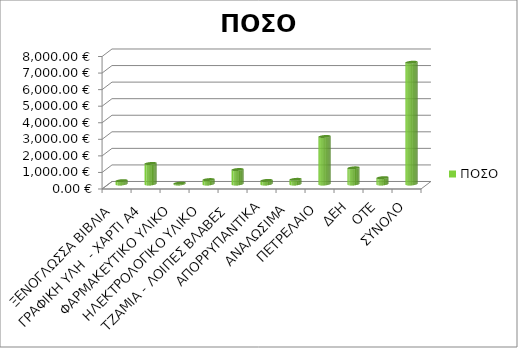
| Category | ΠΟΣΟ |
|---|---|
| ΞΕΝΟΓΛΩΣΣΑ ΒΙΒΛΙΑ | 201.1 |
| ΓΡΑΦΙΚΗ ΥΛΗ  - ΧΑΡΤΙ Α4 | 1240 |
| ΦΑΡΜΑΚΕΥΤΙΚΟ ΥΛΙΚΟ | 48.45 |
| ΗΛΕΚΤΡΟΛΟΓΙΚΟ ΥΛΙΚΟ | 265.8 |
| ΤΖΑΜΙΑ - ΛΟΙΠΕΣ ΒΛΑΒΕΣ | 873.5 |
| ΑΠΟΡΡΥΠΑΝΤΙΚΑ | 215.3 |
| ΑΝΑΛΩΣΙΜΑ | 280.5 |
| ΠΕΤΡΕΛΑΙΟ | 2870 |
| ΔΕΗ | 975 |
| ΟΤΕ | 382 |
| ΣΥΝΟΛΟ | 7351.65 |